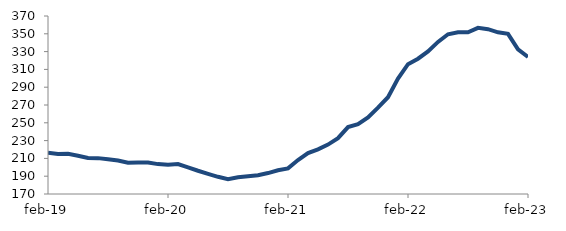
| Category | Series 0 |
|---|---|
| 2019-02-01 | 216.411 |
| 2019-03-01 | 214.996 |
| 2019-04-01 | 215.22 |
| 2019-05-01 | 213.044 |
| 2019-06-01 | 210.411 |
| 2019-07-01 | 210.303 |
| 2019-08-01 | 209.058 |
| 2019-09-01 | 207.556 |
| 2019-10-01 | 205.179 |
| 2019-11-01 | 205.444 |
| 2019-12-01 | 205.45 |
| 2020-01-01 | 203.595 |
| 2020-02-01 | 202.996 |
| 2020-03-01 | 203.606 |
| 2020-04-01 | 199.997 |
| 2020-05-01 | 196.129 |
| 2020-06-01 | 192.644 |
| 2020-07-01 | 189.309 |
| 2020-08-01 | 186.635 |
| 2020-09-01 | 188.903 |
| 2020-10-01 | 189.967 |
| 2020-11-01 | 191.14 |
| 2020-12-01 | 193.522 |
| 2021-01-01 | 196.705 |
| 2021-02-01 | 198.76 |
| 2021-03-01 | 208.155 |
| 2021-04-01 | 215.916 |
| 2021-05-01 | 220.213 |
| 2021-06-01 | 225.532 |
| 2021-07-01 | 232.751 |
| 2021-08-01 | 245.217 |
| 2021-09-01 | 248.367 |
| 2021-10-01 | 256.011 |
| 2021-11-01 | 267.005 |
| 2021-12-01 | 278.738 |
| 2022-01-01 | 299.641 |
| 2022-02-01 | 315.847 |
| 2022-03-01 | 321.979 |
| 2022-04-01 | 330.13 |
| 2022-05-01 | 340.885 |
| 2022-06-01 | 349.463 |
| 2022-07-01 | 351.79 |
| 2022-08-01 | 351.673 |
| 2022-09-01 | 356.67 |
| 2022-10-01 | 355.158 |
| 2022-11-01 | 351.634 |
| 2022-12-01 | 349.966 |
| 2023-01-01 | 332.533 |
| 2023-02-01 | 323.969 |